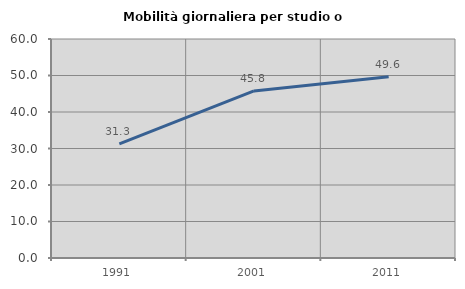
| Category | Mobilità giornaliera per studio o lavoro |
|---|---|
| 1991.0 | 31.285 |
| 2001.0 | 45.775 |
| 2011.0 | 49.63 |